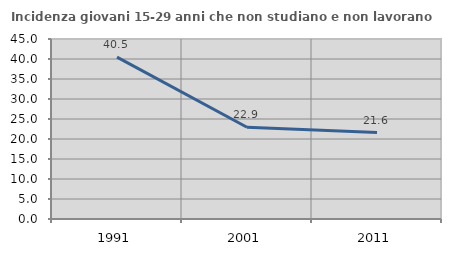
| Category | Incidenza giovani 15-29 anni che non studiano e non lavorano  |
|---|---|
| 1991.0 | 40.476 |
| 2001.0 | 22.934 |
| 2011.0 | 21.611 |